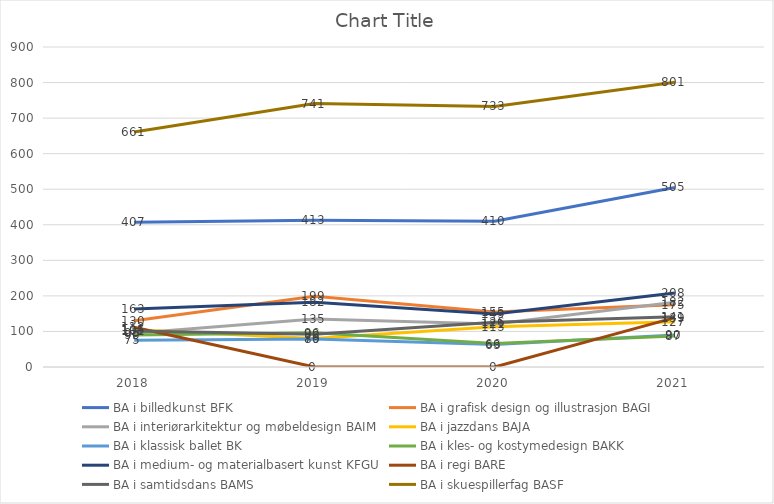
| Category | BA i billedkunst | BA i grafisk design og illustrasjon | BA i interiørarkitektur og møbeldesign | BA i jazzdans | BA i klassisk ballet | BA i kles- og kostymedesign | BA i medium- og materialbasert kunst | BA i regi | BA i samtidsdans | BA i skuespillerfag |
|---|---|---|---|---|---|---|---|---|---|---|
| 2018.0 | 407 | 130 | 95 | 105 | 75 | 90 | 163 | 112 | 101 | 661 |
| 2019.0 | 413 | 199 | 135 | 80 | 79 | 96 | 182 | 0 | 92 | 741 |
| 2020.0 | 410 | 155 | 121 | 113 | 63 | 66 | 149 | 0 | 126 | 733 |
| 2021.0 | 505 | 175 | 182 | 127 | 90 | 87 | 208 | 139 | 141 | 801 |